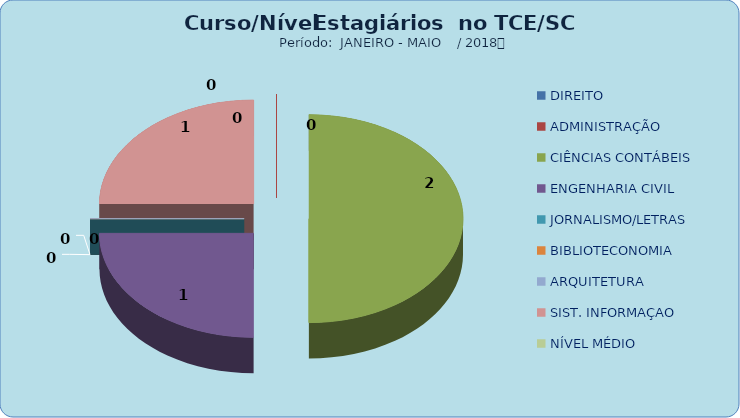
| Category | Series 0 |
|---|---|
| DIREITO | 0 |
| ADMINISTRAÇÃO | 0 |
| CIÊNCIAS CONTÁBEIS | 2 |
| ENGENHARIA CIVIL | 1 |
| JORNALISMO/LETRAS | 0 |
| BIBLIOTECONOMIA | 0 |
| ARQUITETURA | 0 |
| SIST. INFORMAÇAO | 1 |
| NÍVEL MÉDIO | 0 |